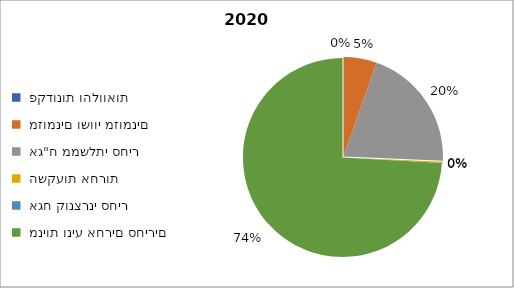
| Category | מנורה מבטחים חסכון לכל ילד מסלול הלכה [11320] - פברואר 2020 |
|---|---|
|  פקדונות והלוואות  | 0 |
|  מזומנים ושווי מזומנים   | 2576 |
|  אג"ח ממשלתי סחיר  | 9640 |
|  השקעות אחרות  | 109 |
|  אגח קונצרני סחיר  | 0 |
|  מניות וניע אחרים סחירים   | 35264 |